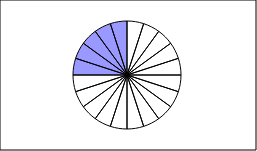
| Category | Series 0 | Series 1 |
|---|---|---|
| 0 | 1 |  |
| 1 | 1 |  |
| 2 | 1 |  |
| 3 | 1 |  |
| 4 | 1 |  |
| 5 | 1 |  |
| 6 | 1 |  |
| 7 | 1 |  |
| 8 | 1 |  |
| 9 | 1 |  |
| 10 | 1 |  |
| 11 | 1 |  |
| 12 | 1 |  |
| 13 | 1 |  |
| 14 | 1 |  |
| 15 | 1 |  |
| 16 | 1 |  |
| 17 | 1 |  |
| 18 | 1 |  |
| 19 | 1 |  |